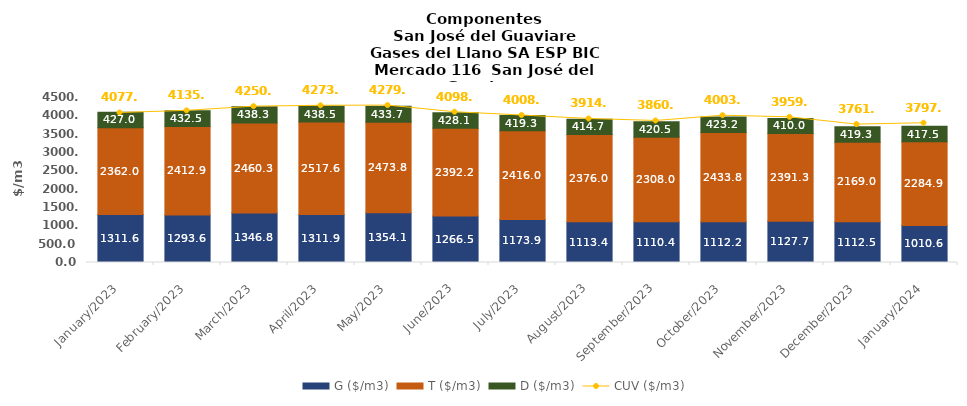
| Category | G ($/m3) | T ($/m3) | D ($/m3) |
|---|---|---|---|
| 2023-01-01 | 1311.57 | 2362.01 | 427.02 |
| 2023-02-01 | 1293.59 | 2412.88 | 432.47 |
| 2023-03-01 | 1346.83 | 2460.32 | 438.26 |
| 2023-04-01 | 1311.89 | 2517.58 | 438.54 |
| 2023-05-01 | 1354.14 | 2473.76 | 433.72 |
| 2023-06-01 | 1266.52 | 2392.24 | 428.13 |
| 2023-07-01 | 1173.91 | 2415.98 | 419.29 |
| 2023-08-01 | 1113.38 | 2375.96 | 414.65 |
| 2023-09-01 | 1110.42 | 2307.98 | 420.53 |
| 2023-10-01 | 1112.24 | 2433.8 | 423.16 |
| 2023-11-01 | 1127.7 | 2391.33 | 410 |
| 2023-12-01 | 1112.49 | 2169.04 | 419.27 |
| 2024-01-01 | 1010.63 | 2284.85 | 417.54 |